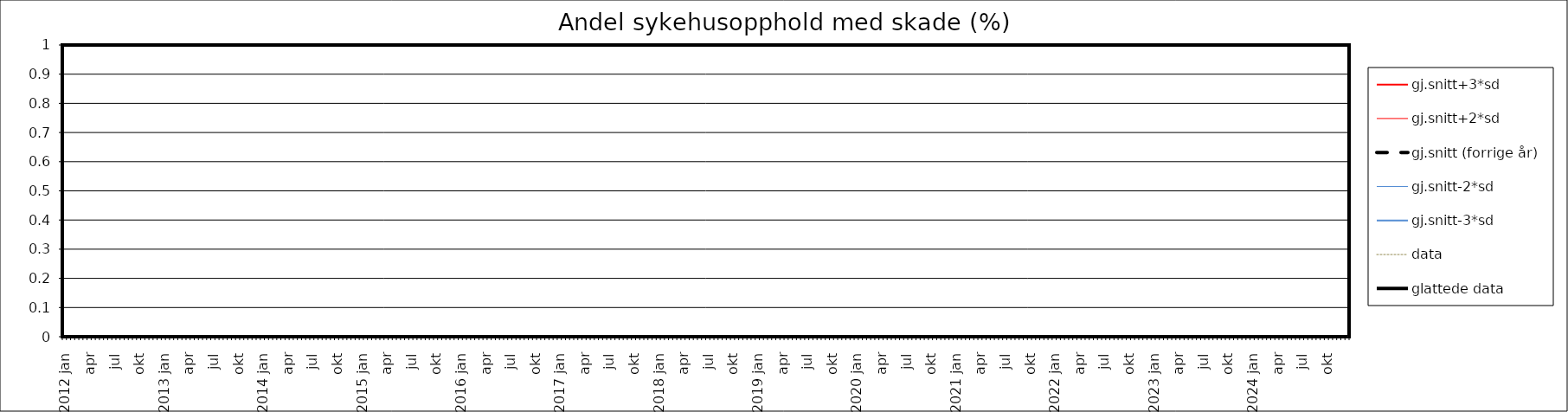
| Category | gj.snitt+3*sd | gj.snitt+2*sd | gj.snitt (forrige år) | gj.snitt-2*sd | gj.snitt-3*sd | data | glattede data |
|---|---|---|---|---|---|---|---|
| 2012 jan | 0 | 0 | 0 | 0 | 0 | 0 | 0 |
|  | 0 | 0 | 0 | 0 | 0 | 0 | 0 |
| feb | 0 | 0 | 0 | 0 | 0 | 0 | 0 |
|  | 0 | 0 | 0 | 0 | 0 | 0 | 0 |
| mar | 0 | 0 | 0 | 0 | 0 | 0 | 0 |
|  | 0 | 0 | 0 | 0 | 0 | 0 | 0 |
| apr | 0 | 0 | 0 | 0 | 0 | 0 | 0 |
|  | 0 | 0 | 0 | 0 | 0 | 0 | 0 |
| mai | 0 | 0 | 0 | 0 | 0 | 0 | 0 |
|  | 0 | 0 | 0 | 0 | 0 | 0 | 0 |
| jun | 0 | 0 | 0 | 0 | 0 | 0 | 0 |
|  | 0 | 0 | 0 | 0 | 0 | 0 | 0 |
| jul | 0 | 0 | 0 | 0 | 0 | 0 | 0 |
|  | 0 | 0 | 0 | 0 | 0 | 0 | 0 |
| aug | 0 | 0 | 0 | 0 | 0 | 0 | 0 |
|  | 0 | 0 | 0 | 0 | 0 | 0 | 0 |
| sep | 0 | 0 | 0 | 0 | 0 | 0 | 0 |
|  | 0 | 0 | 0 | 0 | 0 | 0 | 0 |
| okt | 0 | 0 | 0 | 0 | 0 | 0 | 0 |
|  | 0 | 0 | 0 | 0 | 0 | 0 | 0 |
| nov | 0 | 0 | 0 | 0 | 0 | 0 | 0 |
|  | 0 | 0 | 0 | 0 | 0 | 0 | 0 |
| des | 0 | 0 | 0 | 0 | 0 | 0 | 0 |
|  | 0 | 0 | 0 | 0 | 0 | 0 | 0 |
| 2013 jan | 0 | 0 | 0 | 0 | 0 | 0 | 0 |
|  | 0 | 0 | 0 | 0 | 0 | 0 | 0 |
| feb | 0 | 0 | 0 | 0 | 0 | 0 | 0 |
|  | 0 | 0 | 0 | 0 | 0 | 0 | 0 |
| mar | 0 | 0 | 0 | 0 | 0 | 0 | 0 |
|  | 0 | 0 | 0 | 0 | 0 | 0 | 0 |
| apr | 0 | 0 | 0 | 0 | 0 | 0 | 0 |
|  | 0 | 0 | 0 | 0 | 0 | 0 | 0 |
| mai | 0 | 0 | 0 | 0 | 0 | 0 | 0 |
|  | 0 | 0 | 0 | 0 | 0 | 0 | 0 |
| jun | 0 | 0 | 0 | 0 | 0 | 0 | 0 |
|  | 0 | 0 | 0 | 0 | 0 | 0 | 0 |
| jul | 0 | 0 | 0 | 0 | 0 | 0 | 0 |
|  | 0 | 0 | 0 | 0 | 0 | 0 | 0 |
| aug | 0 | 0 | 0 | 0 | 0 | 0 | 0 |
|  | 0 | 0 | 0 | 0 | 0 | 0 | 0 |
| sep | 0 | 0 | 0 | 0 | 0 | 0 | 0 |
|  | 0 | 0 | 0 | 0 | 0 | 0 | 0 |
| okt | 0 | 0 | 0 | 0 | 0 | 0 | 0 |
|  | 0 | 0 | 0 | 0 | 0 | 0 | 0 |
| nov | 0 | 0 | 0 | 0 | 0 | 0 | 0 |
|  | 0 | 0 | 0 | 0 | 0 | 0 | 0 |
| des | 0 | 0 | 0 | 0 | 0 | 0 | 0 |
|  | 0 | 0 | 0 | 0 | 0 | 0 | 0 |
| 2014 jan | 0 | 0 | 0 | 0 | 0 | 0 | 0 |
|  | 0 | 0 | 0 | 0 | 0 | 0 | 0 |
| feb | 0 | 0 | 0 | 0 | 0 | 0 | 0 |
|  | 0 | 0 | 0 | 0 | 0 | 0 | 0 |
| mar | 0 | 0 | 0 | 0 | 0 | 0 | 0 |
|  | 0 | 0 | 0 | 0 | 0 | 0 | 0 |
| apr | 0 | 0 | 0 | 0 | 0 | 0 | 0 |
|  | 0 | 0 | 0 | 0 | 0 | 0 | 0 |
| mai | 0 | 0 | 0 | 0 | 0 | 0 | 0 |
|  | 0 | 0 | 0 | 0 | 0 | 0 | 0 |
| jun | 0 | 0 | 0 | 0 | 0 | 0 | 0 |
|  | 0 | 0 | 0 | 0 | 0 | 0 | 0 |
| jul | 0 | 0 | 0 | 0 | 0 | 0 | 0 |
|  | 0 | 0 | 0 | 0 | 0 | 0 | 0 |
| aug | 0 | 0 | 0 | 0 | 0 | 0 | 0 |
|  | 0 | 0 | 0 | 0 | 0 | 0 | 0 |
| sep | 0 | 0 | 0 | 0 | 0 | 0 | 0 |
|  | 0 | 0 | 0 | 0 | 0 | 0 | 0 |
| okt | 0 | 0 | 0 | 0 | 0 | 0 | 0 |
|  | 0 | 0 | 0 | 0 | 0 | 0 | 0 |
| nov | 0 | 0 | 0 | 0 | 0 | 0 | 0 |
|  | 0 | 0 | 0 | 0 | 0 | 0 | 0 |
| des | 0 | 0 | 0 | 0 | 0 | 0 | 0 |
|  | 0 | 0 | 0 | 0 | 0 | 0 | 0 |
| 2015 jan | 0 | 0 | 0 | 0 | 0 | 0 | 0 |
|  | 0 | 0 | 0 | 0 | 0 | 0 | 0 |
| feb | 0 | 0 | 0 | 0 | 0 | 0 | 0 |
|  | 0 | 0 | 0 | 0 | 0 | 0 | 0 |
| mar | 0 | 0 | 0 | 0 | 0 | 0 | 0 |
|  | 0 | 0 | 0 | 0 | 0 | 0 | 0 |
| apr | 0 | 0 | 0 | 0 | 0 | 0 | 0 |
|  | 0 | 0 | 0 | 0 | 0 | 0 | 0 |
| mai | 0 | 0 | 0 | 0 | 0 | 0 | 0 |
|  | 0 | 0 | 0 | 0 | 0 | 0 | 0 |
| jun | 0 | 0 | 0 | 0 | 0 | 0 | 0 |
|  | 0 | 0 | 0 | 0 | 0 | 0 | 0 |
| jul | 0 | 0 | 0 | 0 | 0 | 0 | 0 |
|  | 0 | 0 | 0 | 0 | 0 | 0 | 0 |
| aug | 0 | 0 | 0 | 0 | 0 | 0 | 0 |
|  | 0 | 0 | 0 | 0 | 0 | 0 | 0 |
| sep | 0 | 0 | 0 | 0 | 0 | 0 | 0 |
|  | 0 | 0 | 0 | 0 | 0 | 0 | 0 |
| okt | 0 | 0 | 0 | 0 | 0 | 0 | 0 |
|  | 0 | 0 | 0 | 0 | 0 | 0 | 0 |
| nov | 0 | 0 | 0 | 0 | 0 | 0 | 0 |
|  | 0 | 0 | 0 | 0 | 0 | 0 | 0 |
| des | 0 | 0 | 0 | 0 | 0 | 0 | 0 |
|  | 0 | 0 | 0 | 0 | 0 | 0 | 0 |
| 2016 jan | 0 | 0 | 0 | 0 | 0 | 0 | 0 |
|  | 0 | 0 | 0 | 0 | 0 | 0 | 0 |
| feb | 0 | 0 | 0 | 0 | 0 | 0 | 0 |
|  | 0 | 0 | 0 | 0 | 0 | 0 | 0 |
| mar | 0 | 0 | 0 | 0 | 0 | 0 | 0 |
|  | 0 | 0 | 0 | 0 | 0 | 0 | 0 |
| apr | 0 | 0 | 0 | 0 | 0 | 0 | 0 |
|  | 0 | 0 | 0 | 0 | 0 | 0 | 0 |
| mai | 0 | 0 | 0 | 0 | 0 | 0 | 0 |
|  | 0 | 0 | 0 | 0 | 0 | 0 | 0 |
| jun | 0 | 0 | 0 | 0 | 0 | 0 | 0 |
|  | 0 | 0 | 0 | 0 | 0 | 0 | 0 |
| jul | 0 | 0 | 0 | 0 | 0 | 0 | 0 |
|  | 0 | 0 | 0 | 0 | 0 | 0 | 0 |
| aug | 0 | 0 | 0 | 0 | 0 | 0 | 0 |
|  | 0 | 0 | 0 | 0 | 0 | 0 | 0 |
| sep | 0 | 0 | 0 | 0 | 0 | 0 | 0 |
|  | 0 | 0 | 0 | 0 | 0 | 0 | 0 |
| okt | 0 | 0 | 0 | 0 | 0 | 0 | 0 |
|  | 0 | 0 | 0 | 0 | 0 | 0 | 0 |
| nov | 0 | 0 | 0 | 0 | 0 | 0 | 0 |
|  | 0 | 0 | 0 | 0 | 0 | 0 | 0 |
| des | 0 | 0 | 0 | 0 | 0 | 0 | 0 |
|  | 0 | 0 | 0 | 0 | 0 | 0 | 0 |
| 2017 jan | 0 | 0 | 0 | 0 | 0 | 0 | 0 |
|  | 0 | 0 | 0 | 0 | 0 | 0 | 0 |
| feb | 0 | 0 | 0 | 0 | 0 | 0 | 0 |
|  | 0 | 0 | 0 | 0 | 0 | 0 | 0 |
| mar | 0 | 0 | 0 | 0 | 0 | 0 | 0 |
|  | 0 | 0 | 0 | 0 | 0 | 0 | 0 |
| apr | 0 | 0 | 0 | 0 | 0 | 0 | 0 |
|  | 0 | 0 | 0 | 0 | 0 | 0 | 0 |
| mai | 0 | 0 | 0 | 0 | 0 | 0 | 0 |
|  | 0 | 0 | 0 | 0 | 0 | 0 | 0 |
| jun | 0 | 0 | 0 | 0 | 0 | 0 | 0 |
|  | 0 | 0 | 0 | 0 | 0 | 0 | 0 |
| jul | 0 | 0 | 0 | 0 | 0 | 0 | 0 |
|  | 0 | 0 | 0 | 0 | 0 | 0 | 0 |
| aug | 0 | 0 | 0 | 0 | 0 | 0 | 0 |
|  | 0 | 0 | 0 | 0 | 0 | 0 | 0 |
| sep | 0 | 0 | 0 | 0 | 0 | 0 | 0 |
|  | 0 | 0 | 0 | 0 | 0 | 0 | 0 |
| okt | 0 | 0 | 0 | 0 | 0 | 0 | 0 |
|  | 0 | 0 | 0 | 0 | 0 | 0 | 0 |
| nov | 0 | 0 | 0 | 0 | 0 | 0 | 0 |
|  | 0 | 0 | 0 | 0 | 0 | 0 | 0 |
| des | 0 | 0 | 0 | 0 | 0 | 0 | 0 |
|  | 0 | 0 | 0 | 0 | 0 | 0 | 0 |
| 2018 jan | 0 | 0 | 0 | 0 | 0 | 0 | 0 |
|  | 0 | 0 | 0 | 0 | 0 | 0 | 0 |
| feb | 0 | 0 | 0 | 0 | 0 | 0 | 0 |
|  | 0 | 0 | 0 | 0 | 0 | 0 | 0 |
| mar | 0 | 0 | 0 | 0 | 0 | 0 | 0 |
|  | 0 | 0 | 0 | 0 | 0 | 0 | 0 |
| apr | 0 | 0 | 0 | 0 | 0 | 0 | 0 |
|  | 0 | 0 | 0 | 0 | 0 | 0 | 0 |
| mai | 0 | 0 | 0 | 0 | 0 | 0 | 0 |
|  | 0 | 0 | 0 | 0 | 0 | 0 | 0 |
| jun | 0 | 0 | 0 | 0 | 0 | 0 | 0 |
|  | 0 | 0 | 0 | 0 | 0 | 0 | 0 |
| jul | 0 | 0 | 0 | 0 | 0 | 0 | 0 |
|  | 0 | 0 | 0 | 0 | 0 | 0 | 0 |
| aug | 0 | 0 | 0 | 0 | 0 | 0 | 0 |
|  | 0 | 0 | 0 | 0 | 0 | 0 | 0 |
| sep | 0 | 0 | 0 | 0 | 0 | 0 | 0 |
|  | 0 | 0 | 0 | 0 | 0 | 0 | 0 |
| okt | 0 | 0 | 0 | 0 | 0 | 0 | 0 |
|  | 0 | 0 | 0 | 0 | 0 | 0 | 0 |
| nov | 0 | 0 | 0 | 0 | 0 | 0 | 0 |
|  | 0 | 0 | 0 | 0 | 0 | 0 | 0 |
| des | 0 | 0 | 0 | 0 | 0 | 0 | 0 |
|  | 0 | 0 | 0 | 0 | 0 | 0 | 0 |
| 2019 jan | 0 | 0 | 0 | 0 | 0 | 0 | 0 |
|  | 0 | 0 | 0 | 0 | 0 | 0 | 0 |
| feb | 0 | 0 | 0 | 0 | 0 | 0 | 0 |
|  | 0 | 0 | 0 | 0 | 0 | 0 | 0 |
| mar | 0 | 0 | 0 | 0 | 0 | 0 | 0 |
|  | 0 | 0 | 0 | 0 | 0 | 0 | 0 |
| apr | 0 | 0 | 0 | 0 | 0 | 0 | 0 |
|  | 0 | 0 | 0 | 0 | 0 | 0 | 0 |
| mai | 0 | 0 | 0 | 0 | 0 | 0 | 0 |
|  | 0 | 0 | 0 | 0 | 0 | 0 | 0 |
| jun | 0 | 0 | 0 | 0 | 0 | 0 | 0 |
|  | 0 | 0 | 0 | 0 | 0 | 0 | 0 |
| jul | 0 | 0 | 0 | 0 | 0 | 0 | 0 |
|  | 0 | 0 | 0 | 0 | 0 | 0 | 0 |
| aug | 0 | 0 | 0 | 0 | 0 | 0 | 0 |
|  | 0 | 0 | 0 | 0 | 0 | 0 | 0 |
| sep | 0 | 0 | 0 | 0 | 0 | 0 | 0 |
|  | 0 | 0 | 0 | 0 | 0 | 0 | 0 |
| okt | 0 | 0 | 0 | 0 | 0 | 0 | 0 |
|  | 0 | 0 | 0 | 0 | 0 | 0 | 0 |
| nov | 0 | 0 | 0 | 0 | 0 | 0 | 0 |
|  | 0 | 0 | 0 | 0 | 0 | 0 | 0 |
| des | 0 | 0 | 0 | 0 | 0 | 0 | 0 |
|  | 0 | 0 | 0 | 0 | 0 | 0 | 0 |
| 2020 jan | 0 | 0 | 0 | 0 | 0 | 0 | 0 |
|  | 0 | 0 | 0 | 0 | 0 | 0 | 0 |
| feb | 0 | 0 | 0 | 0 | 0 | 0 | 0 |
|  | 0 | 0 | 0 | 0 | 0 | 0 | 0 |
| mar | 0 | 0 | 0 | 0 | 0 | 0 | 0 |
|  | 0 | 0 | 0 | 0 | 0 | 0 | 0 |
| apr | 0 | 0 | 0 | 0 | 0 | 0 | 0 |
|  | 0 | 0 | 0 | 0 | 0 | 0 | 0 |
| mai | 0 | 0 | 0 | 0 | 0 | 0 | 0 |
|  | 0 | 0 | 0 | 0 | 0 | 0 | 0 |
| jun | 0 | 0 | 0 | 0 | 0 | 0 | 0 |
|  | 0 | 0 | 0 | 0 | 0 | 0 | 0 |
| jul | 0 | 0 | 0 | 0 | 0 | 0 | 0 |
|  | 0 | 0 | 0 | 0 | 0 | 0 | 0 |
| aug | 0 | 0 | 0 | 0 | 0 | 0 | 0 |
|  | 0 | 0 | 0 | 0 | 0 | 0 | 0 |
| sep | 0 | 0 | 0 | 0 | 0 | 0 | 0 |
|  | 0 | 0 | 0 | 0 | 0 | 0 | 0 |
| okt | 0 | 0 | 0 | 0 | 0 | 0 | 0 |
|  | 0 | 0 | 0 | 0 | 0 | 0 | 0 |
| nov | 0 | 0 | 0 | 0 | 0 | 0 | 0 |
|  | 0 | 0 | 0 | 0 | 0 | 0 | 0 |
| des | 0 | 0 | 0 | 0 | 0 | 0 | 0 |
|  | 0 | 0 | 0 | 0 | 0 | 0 | 0 |
| 2021 jan | 0 | 0 | 0 | 0 | 0 | 0 | 0 |
|  | 0 | 0 | 0 | 0 | 0 | 0 | 0 |
| feb | 0 | 0 | 0 | 0 | 0 | 0 | 0 |
|  | 0 | 0 | 0 | 0 | 0 | 0 | 0 |
| mar | 0 | 0 | 0 | 0 | 0 | 0 | 0 |
|  | 0 | 0 | 0 | 0 | 0 | 0 | 0 |
| apr | 0 | 0 | 0 | 0 | 0 | 0 | 0 |
|  | 0 | 0 | 0 | 0 | 0 | 0 | 0 |
| mai | 0 | 0 | 0 | 0 | 0 | 0 | 0 |
|  | 0 | 0 | 0 | 0 | 0 | 0 | 0 |
| jun | 0 | 0 | 0 | 0 | 0 | 0 | 0 |
|  | 0 | 0 | 0 | 0 | 0 | 0 | 0 |
| jul | 0 | 0 | 0 | 0 | 0 | 0 | 0 |
|  | 0 | 0 | 0 | 0 | 0 | 0 | 0 |
| aug | 0 | 0 | 0 | 0 | 0 | 0 | 0 |
|  | 0 | 0 | 0 | 0 | 0 | 0 | 0 |
| sep | 0 | 0 | 0 | 0 | 0 | 0 | 0 |
|  | 0 | 0 | 0 | 0 | 0 | 0 | 0 |
| okt | 0 | 0 | 0 | 0 | 0 | 0 | 0 |
|  | 0 | 0 | 0 | 0 | 0 | 0 | 0 |
| nov | 0 | 0 | 0 | 0 | 0 | 0 | 0 |
|  | 0 | 0 | 0 | 0 | 0 | 0 | 0 |
| des | 0 | 0 | 0 | 0 | 0 | 0 | 0 |
|  | 0 | 0 | 0 | 0 | 0 | 0 | 0 |
| 2022 jan | 0 | 0 | 0 | 0 | 0 | 0 | 0 |
|  | 0 | 0 | 0 | 0 | 0 | 0 | 0 |
| feb | 0 | 0 | 0 | 0 | 0 | 0 | 0 |
|  | 0 | 0 | 0 | 0 | 0 | 0 | 0 |
| mar | 0 | 0 | 0 | 0 | 0 | 0 | 0 |
|  | 0 | 0 | 0 | 0 | 0 | 0 | 0 |
| apr | 0 | 0 | 0 | 0 | 0 | 0 | 0 |
|  | 0 | 0 | 0 | 0 | 0 | 0 | 0 |
| mai | 0 | 0 | 0 | 0 | 0 | 0 | 0 |
|  | 0 | 0 | 0 | 0 | 0 | 0 | 0 |
| jun | 0 | 0 | 0 | 0 | 0 | 0 | 0 |
|  | 0 | 0 | 0 | 0 | 0 | 0 | 0 |
| jul | 0 | 0 | 0 | 0 | 0 | 0 | 0 |
|  | 0 | 0 | 0 | 0 | 0 | 0 | 0 |
| aug | 0 | 0 | 0 | 0 | 0 | 0 | 0 |
|  | 0 | 0 | 0 | 0 | 0 | 0 | 0 |
| sep | 0 | 0 | 0 | 0 | 0 | 0 | 0 |
|  | 0 | 0 | 0 | 0 | 0 | 0 | 0 |
| okt | 0 | 0 | 0 | 0 | 0 | 0 | 0 |
|  | 0 | 0 | 0 | 0 | 0 | 0 | 0 |
| nov | 0 | 0 | 0 | 0 | 0 | 0 | 0 |
|  | 0 | 0 | 0 | 0 | 0 | 0 | 0 |
| des | 0 | 0 | 0 | 0 | 0 | 0 | 0 |
|  | 0 | 0 | 0 | 0 | 0 | 0 | 0 |
| 2023 jan | 0 | 0 | 0 | 0 | 0 | 0 | 0 |
|  | 0 | 0 | 0 | 0 | 0 | 0 | 0 |
| feb | 0 | 0 | 0 | 0 | 0 | 0 | 0 |
|  | 0 | 0 | 0 | 0 | 0 | 0 | 0 |
| mar | 0 | 0 | 0 | 0 | 0 | 0 | 0 |
|  | 0 | 0 | 0 | 0 | 0 | 0 | 0 |
| apr | 0 | 0 | 0 | 0 | 0 | 0 | 0 |
|  | 0 | 0 | 0 | 0 | 0 | 0 | 0 |
| mai | 0 | 0 | 0 | 0 | 0 | 0 | 0 |
|  | 0 | 0 | 0 | 0 | 0 | 0 | 0 |
| jun | 0 | 0 | 0 | 0 | 0 | 0 | 0 |
|  | 0 | 0 | 0 | 0 | 0 | 0 | 0 |
| jul | 0 | 0 | 0 | 0 | 0 | 0 | 0 |
|  | 0 | 0 | 0 | 0 | 0 | 0 | 0 |
| aug | 0 | 0 | 0 | 0 | 0 | 0 | 0 |
|  | 0 | 0 | 0 | 0 | 0 | 0 | 0 |
| sep | 0 | 0 | 0 | 0 | 0 | 0 | 0 |
|  | 0 | 0 | 0 | 0 | 0 | 0 | 0 |
| okt | 0 | 0 | 0 | 0 | 0 | 0 | 0 |
|  | 0 | 0 | 0 | 0 | 0 | 0 | 0 |
| nov | 0 | 0 | 0 | 0 | 0 | 0 | 0 |
|  | 0 | 0 | 0 | 0 | 0 | 0 | 0 |
| des | 0 | 0 | 0 | 0 | 0 | 0 | 0 |
|  | 0 | 0 | 0 | 0 | 0 | 0 | 0 |
| 2024 jan | 0 | 0 | 0 | 0 | 0 | 0 | 0 |
|  | 0 | 0 | 0 | 0 | 0 | 0 | 0 |
| feb | 0 | 0 | 0 | 0 | 0 | 0 | 0 |
|  | 0 | 0 | 0 | 0 | 0 | 0 | 0 |
| mar | 0 | 0 | 0 | 0 | 0 | 0 | 0 |
|  | 0 | 0 | 0 | 0 | 0 | 0 | 0 |
| apr | 0 | 0 | 0 | 0 | 0 | 0 | 0 |
|  | 0 | 0 | 0 | 0 | 0 | 0 | 0 |
| mai | 0 | 0 | 0 | 0 | 0 | 0 | 0 |
|  | 0 | 0 | 0 | 0 | 0 | 0 | 0 |
| jun | 0 | 0 | 0 | 0 | 0 | 0 | 0 |
|  | 0 | 0 | 0 | 0 | 0 | 0 | 0 |
| jul | 0 | 0 | 0 | 0 | 0 | 0 | 0 |
|  | 0 | 0 | 0 | 0 | 0 | 0 | 0 |
| aug | 0 | 0 | 0 | 0 | 0 | 0 | 0 |
|  | 0 | 0 | 0 | 0 | 0 | 0 | 0 |
| sep | 0 | 0 | 0 | 0 | 0 | 0 | 0 |
|  | 0 | 0 | 0 | 0 | 0 | 0 | 0 |
| okt | 0 | 0 | 0 | 0 | 0 | 0 | 0 |
|  | 0 | 0 | 0 | 0 | 0 | 0 | 0 |
| nov | 0 | 0 | 0 | 0 | 0 | 0 | 0 |
|  | 0 | 0 | 0 | 0 | 0 | 0 | 0 |
| des | 0 | 0 | 0 | 0 | 0 | 0 | 0 |